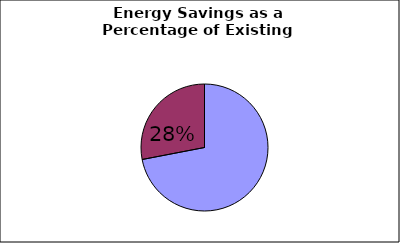
| Category | Series 0 |
|---|---|
| 0 | 140550.445 |
| 1 | 54749.555 |